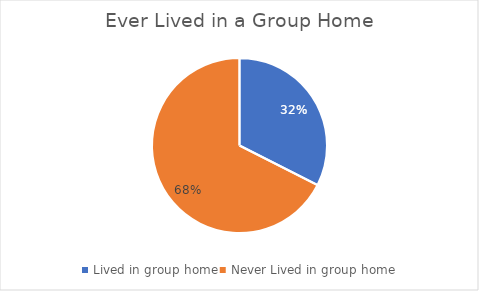
| Category | Series 0 |
|---|---|
| Lived in group home | 0.325 |
| Never Lived in group home | 0.675 |